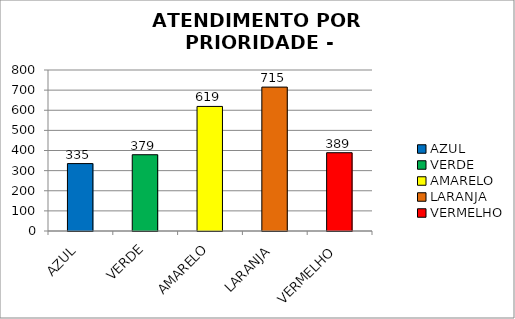
| Category | Total Regional: |
|---|---|
| AZUL | 335 |
| VERDE | 379 |
| AMARELO | 619 |
| LARANJA | 715 |
| VERMELHO | 389 |